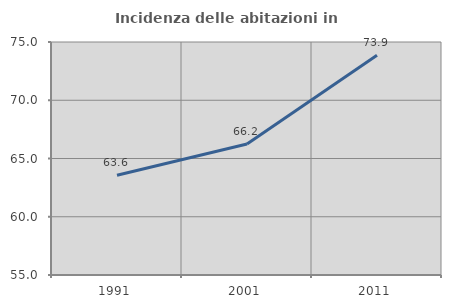
| Category | Incidenza delle abitazioni in proprietà  |
|---|---|
| 1991.0 | 63.559 |
| 2001.0 | 66.247 |
| 2011.0 | 73.858 |